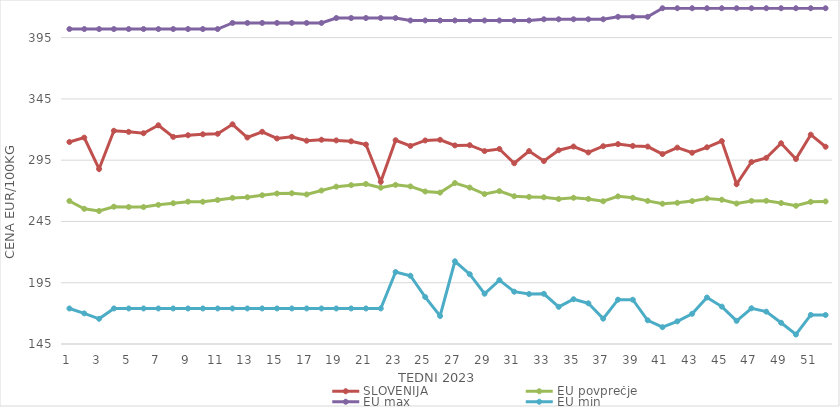
| Category | SLOVENIJA | EU povprečje | EU max | EU min |
|---|---|---|---|---|
| 0 | 309.84 | 261.716 | 402 | 174 |
| 1 | 313.4 | 255.331 | 402 | 169.983 |
| 2 | 287.81 | 253.546 | 402 | 165.574 |
| 3 | 318.98 | 257.051 | 402 | 174 |
| 4 | 318.13 | 256.808 | 402 | 174 |
| 5 | 316.99 | 256.75 | 402 | 174 |
| 6 | 323.47 | 258.565 | 402 | 174 |
| 7 | 314 | 259.872 | 402 | 174 |
| 8 | 315.35 | 261.164 | 402 | 174 |
| 9 | 316.13 | 261.06 | 402 | 174 |
| 10 | 316.55 | 262.513 | 402 | 174 |
| 11 | 324.27 | 264.228 | 407 | 174 |
| 12 | 313.49 | 264.768 | 407 | 174 |
| 13 | 318.17 | 266.385 | 407 | 174 |
| 14 | 312.7 | 267.797 | 407 | 174 |
| 15 | 314.07 | 268.021 | 407 | 174 |
| 16 | 310.87 | 267.041 | 407 | 174 |
| 17 | 311.69 | 270.255 | 407 | 174 |
| 18 | 311.13 | 273.406 | 411 | 174 |
| 19 | 310.42 | 274.631 | 411 | 174 |
| 20 | 307.76 | 275.561 | 411 | 174 |
| 21 | 277.34 | 272.542 | 411 | 174 |
| 22 | 311.28 | 274.85 | 411 | 203.728 |
| 23 | 306.64 | 273.59 | 409 | 200.686 |
| 24 | 311.1 | 269.439 | 409 | 183.275 |
| 25 | 311.62 | 268.544 | 409 | 167.858 |
| 26 | 307.04 | 276.356 | 409 | 212.506 |
| 27 | 307.23 | 272.661 | 409 | 201.945 |
| 28 | 302.45 | 267.357 | 409 | 186.018 |
| 29 | 304.14 | 269.737 | 409 | 197.093 |
| 30 | 292.49 | 265.574 | 409 | 187.684 |
| 31 | 302.41 | 265.054 | 409 | 185.774 |
| 32 | 294.3 | 264.72 | 410 | 185.951 |
| 33 | 303.1 | 263.308 | 410 | 175.332 |
| 34 | 306.13 | 264.307 | 410 | 181.543 |
| 35 | 301.32 | 263.389 | 410 | 178.207 |
| 36 | 306.4 | 261.486 | 410 | 165.697 |
| 37 | 308.12 | 265.47 | 412 | 181.159 |
| 38 | 306.62 | 264.316 | 412 | 181.124 |
| 39 | 306.1 | 261.774 | 412 | 164.37 |
| 40 | 300 | 259.456 | 419 | 158.728 |
| 41 | 305.24 | 260.21 | 419 | 163.464 |
| 42 | 301.07 | 261.605 | 419 | 169.66 |
| 43 | 305.52 | 263.758 | 419 | 182.925 |
| 44 | 310.58 | 262.714 | 419 | 175.524 |
| 45 | 275.46 | 259.625 | 419 | 163.882 |
| 46 | 293.51 | 261.772 | 419 | 174.136 |
| 47 | 296.9 | 261.864 | 419 | 171.4 |
| 48 | 308.8 | 260.014 | 419 | 162.336 |
| 49 | 295.97 | 257.768 | 419 | 152.762 |
| 50 | 315.82 | 261.007 | 419 | 168.739 |
| 51 | 305.97 | 261.323 | 419 | 168.659 |